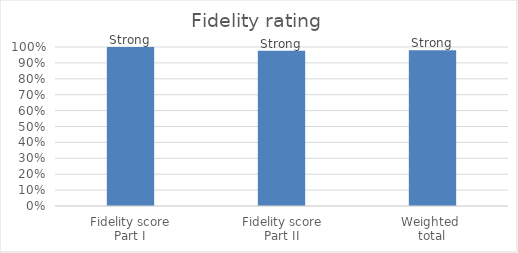
| Category | Series 0 |
|---|---|
| Fidelity score
Part I | 1 |
| Fidelity score
Part II | 0.976 |
| Weighted 
total | 0.979 |